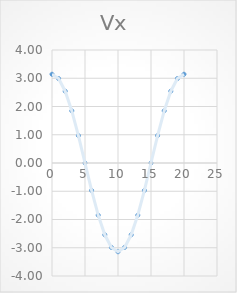
| Category | Series 0 |
|---|---|
| 0.0 | 3.142 |
| 1.0 | 2.988 |
| 2.0 | 2.542 |
| 3.0 | 1.847 |
| 4.0 | 0.971 |
| 5.0 | 0 |
| 6.0 | -0.971 |
| 7.0 | -1.847 |
| 8.0 | -2.542 |
| 9.0 | -2.988 |
| 10.0 | -3.142 |
| 11.0 | -2.988 |
| 12.0 | -2.542 |
| 13.0 | -1.847 |
| 14.0 | -0.971 |
| 15.0 | 0 |
| 16.0 | 0.971 |
| 17.0 | 1.847 |
| 18.0 | 2.542 |
| 19.0 | 2.988 |
| 20.0 | 3.142 |